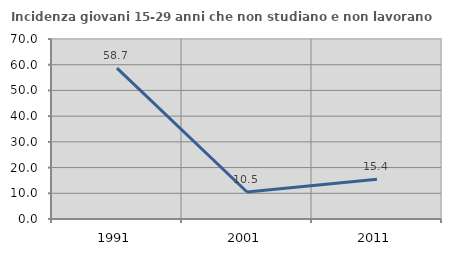
| Category | Incidenza giovani 15-29 anni che non studiano e non lavorano  |
|---|---|
| 1991.0 | 58.675 |
| 2001.0 | 10.507 |
| 2011.0 | 15.438 |